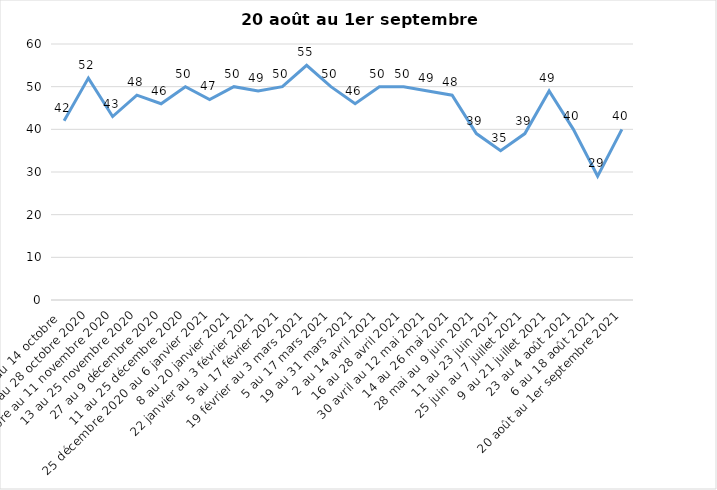
| Category | Toujours aux trois mesures |
|---|---|
| 2 au 14 octobre  | 42 |
| 16 au 28 octobre 2020 | 52 |
| 30 octobre au 11 novembre 2020 | 43 |
| 13 au 25 novembre 2020 | 48 |
| 27 au 9 décembre 2020 | 46 |
| 11 au 25 décembre 2020 | 50 |
| 25 décembre 2020 au 6 janvier 2021 | 47 |
| 8 au 20 janvier 2021 | 50 |
| 22 janvier au 3 février 2021 | 49 |
| 5 au 17 février 2021 | 50 |
| 19 février au 3 mars 2021 | 55 |
| 5 au 17 mars 2021 | 50 |
| 19 au 31 mars 2021 | 46 |
| 2 au 14 avril 2021 | 50 |
| 16 au 28 avril 2021 | 50 |
| 30 avril au 12 mai 2021 | 49 |
| 14 au 26 mai 2021 | 48 |
| 28 mai au 9 juin 2021 | 39 |
| 11 au 23 juin 2021 | 35 |
| 25 juin au 7 juillet 2021 | 39 |
| 9 au 21 juillet 2021 | 49 |
| 23 au 4 août 2021 | 40 |
| 6 au 18 août 2021 | 29 |
| 20 août au 1er septembre 2021 | 40 |